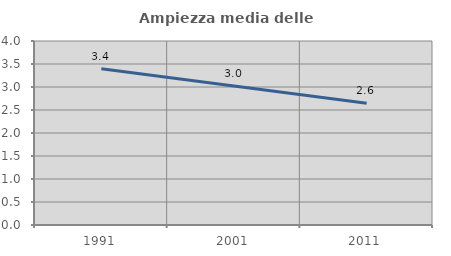
| Category | Ampiezza media delle famiglie |
|---|---|
| 1991.0 | 3.399 |
| 2001.0 | 3.02 |
| 2011.0 | 2.647 |